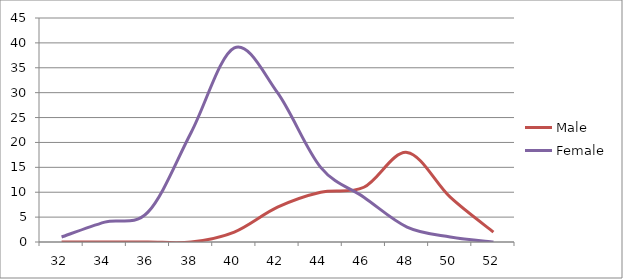
| Category | Male | Female |
|---|---|---|
| 32.0 | 0 | 1 |
| 34.0 | 0 | 4 |
| 36.0 | 0 | 6 |
| 38.0 | 0 | 22 |
| 40.0 | 2 | 39 |
| 42.0 | 7 | 30 |
| 44.0 | 10 | 15 |
| 46.0 | 11 | 9 |
| 48.0 | 18 | 3 |
| 50.0 | 9 | 1 |
| 52.0 | 2 | 0 |